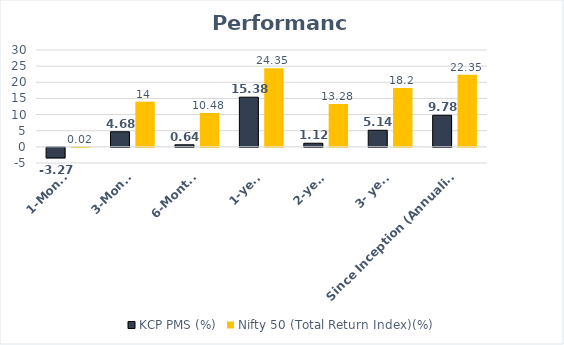
| Category | KCP PMS (%) | Nifty 50 (Total Return Index)(%) |
|---|---|---|
| 1-Month | -3.27 | 0.02 |
| 3-Month | 4.68 | 14 |
| 6-Months | 0.64 | 10.48 |
| 1-year | 15.38 | 24.35 |
| 2-year | 1.12 | 13.28 |
| 3- year | 5.14 | 18.2 |
| Since Inception (Annualised) | 9.78 | 22.35 |